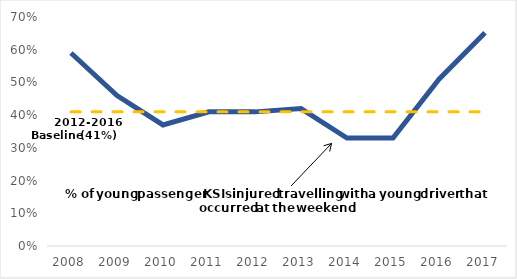
| Category | Series 0 | Series 2 |
|---|---|---|
| 2008.0 | 0.59 | 0.41 |
| 2009.0 | 0.46 | 0.41 |
| 2010.0 | 0.37 | 0.41 |
| 2011.0 | 0.41 | 0.41 |
| 2012.0 | 0.41 | 0.41 |
| 2013.0 | 0.42 | 0.41 |
| 2014.0 | 0.33 | 0.41 |
| 2015.0 | 0.33 | 0.41 |
| 2016.0 | 0.51 | 0.41 |
| 2017.0 | 0.652 | 0.41 |